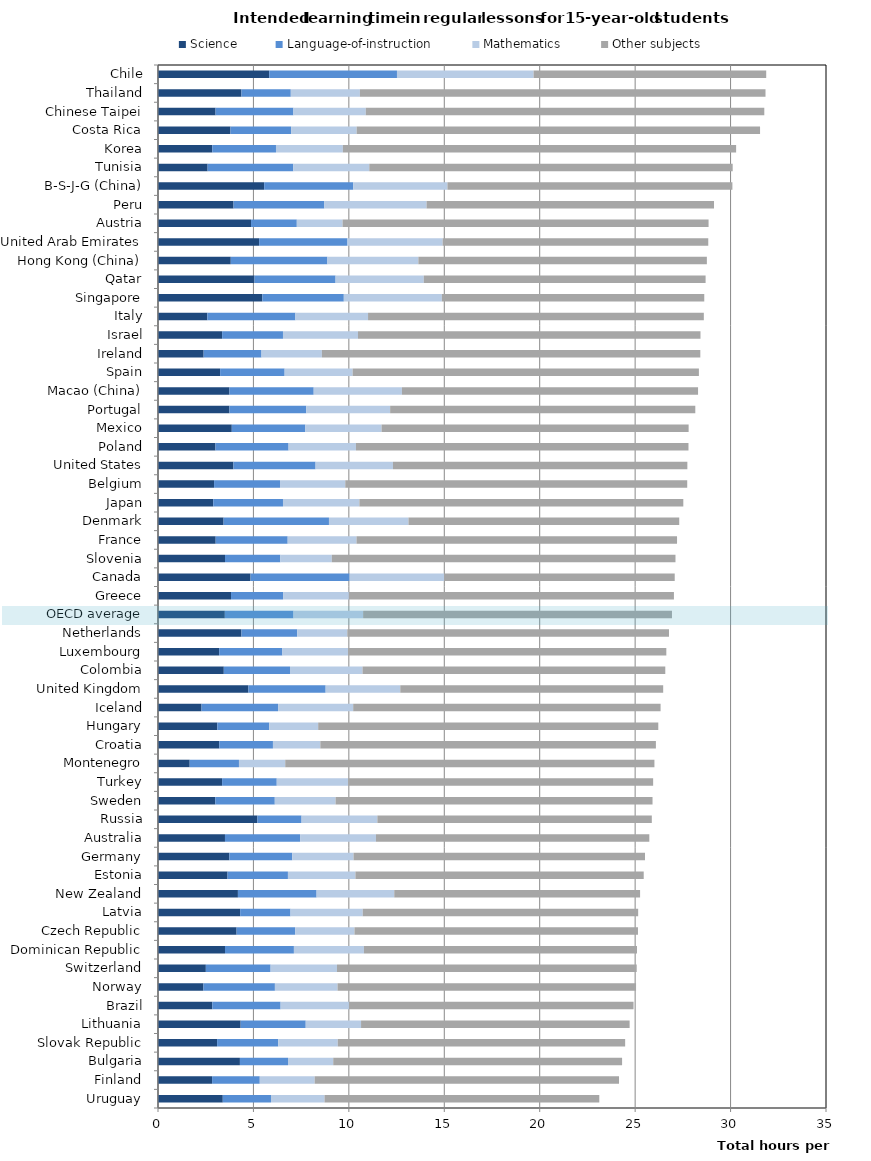
| Category | Science | Language-of-instruction | Mathematics | Other subjects |
|---|---|---|---|---|
| Uruguay | 3.394 | 2.526 | 2.806 | 14.396 |
| Finland | 2.834 | 2.498 | 2.877 | 15.946 |
| Bulgaria | 4.292 | 2.519 | 2.37 | 15.134 |
| Slovak Republic | 3.097 | 3.203 | 3.119 | 15.057 |
| Lithuania | 4.331 | 3.409 | 2.899 | 14.072 |
| Brazil | 2.844 | 3.579 | 3.582 | 14.91 |
| Norway | 2.381 | 3.745 | 3.282 | 15.64 |
| Switzerland | 2.507 | 3.393 | 3.478 | 15.704 |
| Dominican Republic | 3.51 | 3.611 | 3.668 | 14.308 |
| Czech Republic | 4.119 | 3.07 | 3.105 | 14.854 |
| Latvia | 4.305 | 2.638 | 3.784 | 14.432 |
| New Zealand | 4.187 | 4.122 | 4.069 | 12.88 |
| Estonia | 3.645 | 3.163 | 3.537 | 15.105 |
| Germany | 3.739 | 3.295 | 3.213 | 15.27 |
| Australia | 3.509 | 3.936 | 3.974 | 14.324 |
| Russia | 5.209 | 2.313 | 3.972 | 14.379 |
| Sweden | 3.004 | 3.115 | 3.186 | 16.606 |
| Turkey | 3.359 | 2.863 | 3.741 | 15.981 |
| Montenegro | 1.661 | 2.581 | 2.424 | 19.344 |
| Croatia | 3.211 | 2.812 | 2.483 | 17.582 |
| Hungary | 3.108 | 2.722 | 2.563 | 17.82 |
| Iceland | 2.282 | 4.011 | 3.934 | 16.106 |
| United Kingdom | 4.738 | 4.046 | 3.911 | 13.775 |
| Colombia | 3.448 | 3.468 | 3.8 | 15.863 |
| Luxembourg | 3.206 | 3.31 | 3.439 | 16.679 |
| Netherlands | 4.373 | 2.92 | 2.624 | 16.856 |
| OECD average | 3.502 | 3.598 | 3.646 | 16.184 |
| Greece | 3.826 | 2.728 | 3.447 | 17.031 |
| Canada | 4.849 | 5.191 | 4.953 | 12.081 |
| Slovenia | 3.511 | 2.899 | 2.697 | 18.006 |
| France | 3.023 | 3.772 | 3.606 | 16.795 |
| Denmark | 3.437 | 5.52 | 4.166 | 14.187 |
| Japan | 2.894 | 3.654 | 4.003 | 16.972 |
| Belgium | 2.938 | 3.455 | 3.419 | 17.916 |
| United States | 3.952 | 4.303 | 4.055 | 15.426 |
| Poland | 3.011 | 3.83 | 3.531 | 17.423 |
| Mexico | 3.866 | 3.852 | 3.996 | 16.088 |
| Portugal | 3.744 | 4.027 | 4.393 | 15.989 |
| Macao (China) | 3.745 | 4.414 | 4.622 | 15.516 |
| Spain | 3.255 | 3.379 | 3.564 | 18.142 |
| Ireland | 2.392 | 3.031 | 3.164 | 19.828 |
| Israel | 3.36 | 3.189 | 3.93 | 17.945 |
| Italy | 2.585 | 4.614 | 3.806 | 17.593 |
| Singapore | 5.468 | 4.267 | 5.137 | 13.749 |
| Qatar | 5.058 | 4.246 | 4.621 | 14.766 |
| Hong Kong (China) | 3.813 | 5.063 | 4.766 | 15.116 |
| United Arab Emirates | 5.299 | 4.63 | 4.984 | 13.918 |
| Austria | 4.875 | 2.398 | 2.399 | 19.176 |
| Peru | 3.958 | 4.758 | 5.356 | 15.061 |
| B-S-J-G (China) | 5.563 | 4.669 | 4.934 | 14.93 |
| Tunisia | 2.601 | 4.489 | 3.981 | 19.041 |
| Korea | 2.843 | 3.339 | 3.503 | 20.606 |
| Costa Rica | 3.796 | 3.178 | 3.433 | 21.137 |
| Chinese Taipei | 3.017 | 4.077 | 3.793 | 20.88 |
| Thailand | 4.373 | 2.585 | 3.622 | 21.25 |
| Chile | 5.827 | 6.694 | 7.158 | 12.188 |